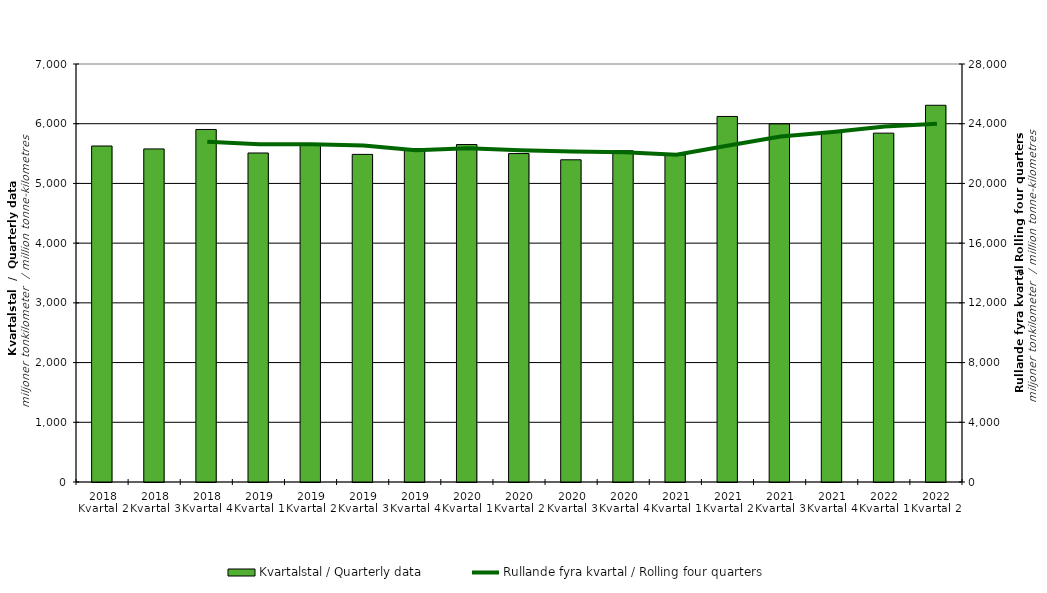
| Category | Kvartalstal / Quarterly data |
|---|---|
| 2018 Kvartal 2 | 5626.784 |
| 2018 Kvartal 3 | 5577.634 |
| 2018 Kvartal 4 | 5903.543 |
| 2019 Kvartal 1 | 5509.773 |
| 2019 Kvartal 2 | 5641.612 |
| 2019 Kvartal 3 | 5486.395 |
| 2019 Kvartal 4 | 5584.286 |
| 2020 Kvartal 1 | 5650.915 |
| 2020 Kvartal 2 | 5500.334 |
| 2020 Kvartal 3 | 5395.987 |
| 2020 Kvartal 4 | 5546.662 |
| 2021 Kvartal 1 | 5476.427 |
| 2021 Kvartal 2 | 6121.807 |
| 2021 Kvartal 3 | 5996.688 |
| 2021 Kvartal 4 | 5853.966 |
| 2022 Kvartal 1 | 5841.994 |
| 2022 Kvartal 2 | 6308.848 |